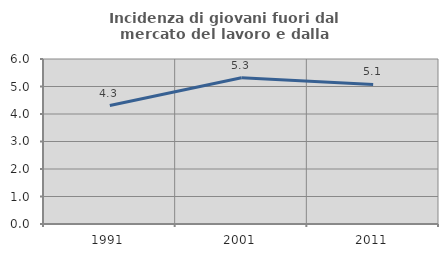
| Category | Incidenza di giovani fuori dal mercato del lavoro e dalla formazione  |
|---|---|
| 1991.0 | 4.307 |
| 2001.0 | 5.319 |
| 2011.0 | 5.076 |